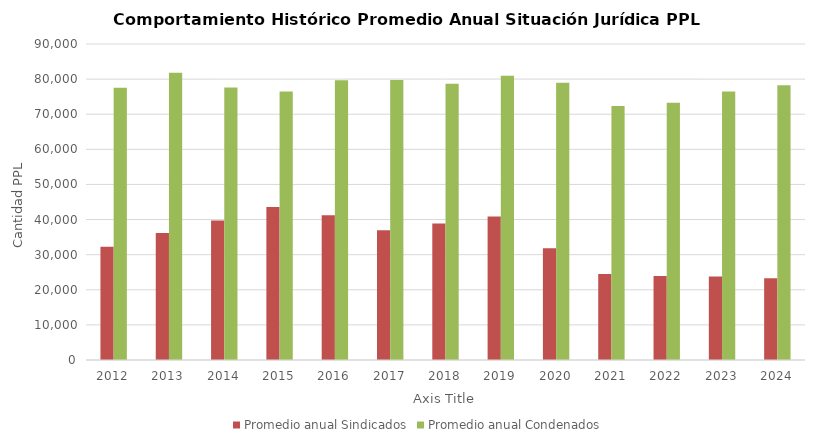
| Category | Promedio anual Sindicados | Promedio anual Condenados |
|---|---|---|
| 2012.0 | 32250.083 | 77572 |
| 2013.0 | 36194.167 | 81792.083 |
| 2014.0 | 39755 | 77634.083 |
| 2015.0 | 43545.833 | 76494.25 |
| 2016.0 | 41229.083 | 79684.917 |
| 2017.0 | 36925.5 | 79732.167 |
| 2018.0 | 38890.25 | 78679.333 |
| 2019.0 | 40870.083 | 80977.25 |
| 2020.0 | 31861.083 | 78969.25 |
| 2021.0 | 24484.417 | 72353.083 |
| 2022.0 | 23917.667 | 73258.25 |
| 2023.0 | 23757.25 | 76504.667 |
| 2024.0 | 23268 | 78271 |